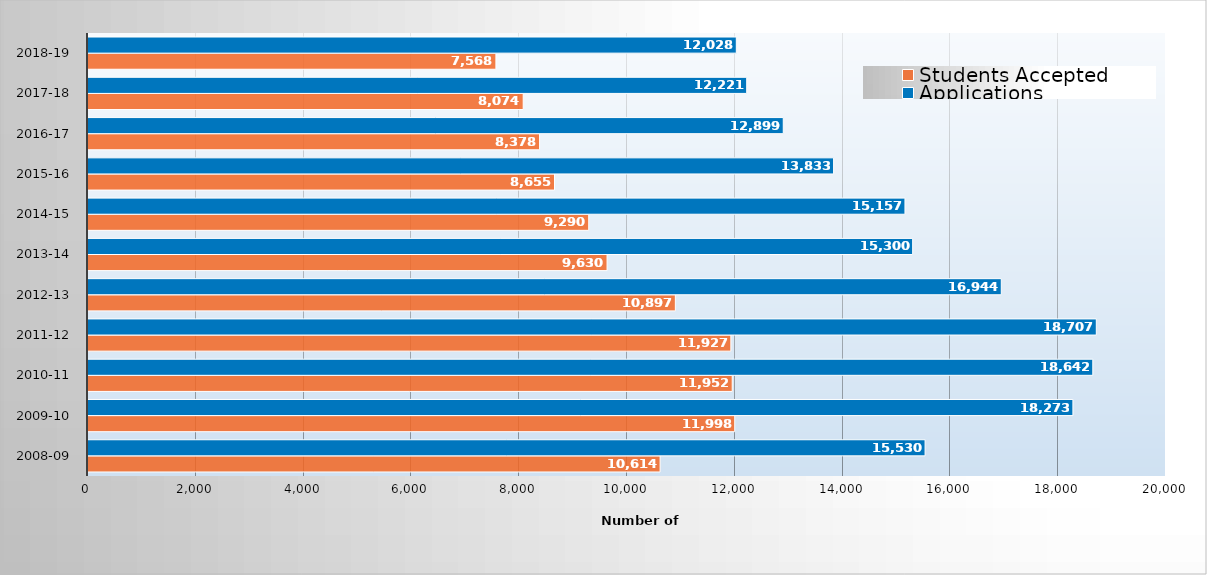
| Category | Students Accepted | Applications |
|---|---|---|
| 2008-09 | 10614 | 15530 |
| 2009-10 | 11998 | 18273 |
| 2010-11 | 11952 | 18642 |
| 2011-12 | 11927 | 18707 |
| 2012-13 | 10897 | 16944 |
| 2013-14 | 9630 | 15300 |
| 2014-15 | 9290 | 15157 |
| 2015-16 | 8655 | 13833 |
| 2016-17 | 8378 | 12899 |
| 2017-18 | 8074 | 12221 |
| 2018-19 | 7568 | 12028 |